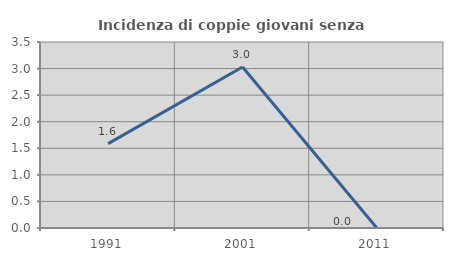
| Category | Incidenza di coppie giovani senza figli |
|---|---|
| 1991.0 | 1.587 |
| 2001.0 | 3.03 |
| 2011.0 | 0 |